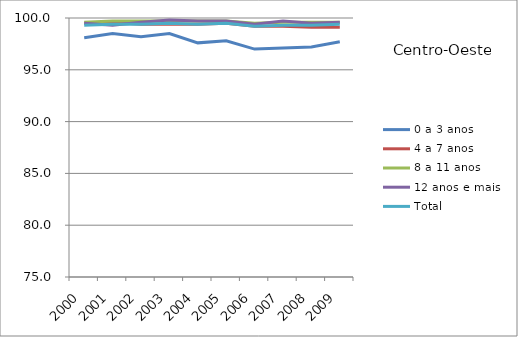
| Category | 0 a 3 anos | 4 a 7 anos | 8 a 11 anos | 12 anos e mais | Total |
|---|---|---|---|---|---|
| 2000.0 | 98.1 | 99.5 | 99.6 | 99.5 | 99.3 |
| 2001.0 | 98.5 | 99.6 | 99.7 | 99.3 | 99.4 |
| 2002.0 | 98.2 | 99.4 | 99.7 | 99.6 | 99.4 |
| 2003.0 | 98.5 | 99.4 | 99.7 | 99.8 | 99.5 |
| 2004.0 | 97.6 | 99.4 | 99.7 | 99.7 | 99.4 |
| 2005.0 | 97.8 | 99.5 | 99.7 | 99.7 | 99.5 |
| 2006.0 | 97 | 99.2 | 99.5 | 99.4 | 99.2 |
| 2007.0 | 97.1 | 99.2 | 99.6 | 99.7 | 99.3 |
| 2008.0 | 97.2 | 99.1 | 99.6 | 99.5 | 99.3 |
| 2009.0 | 97.7 | 99.1 | 99.6 | 99.6 | 99.4 |